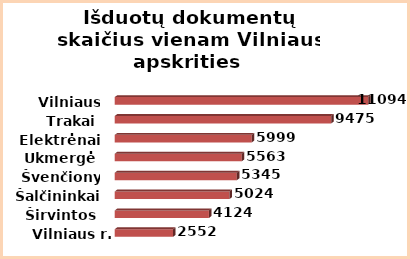
| Category | Series 0 |
|---|---|
| Vilniaus r. | 2552 |
| Širvintos | 4124 |
| Šalčininkai | 5024 |
| Švenčionys | 5345 |
| Ukmergė | 5563 |
| Elektrėnai | 5999 |
| Trakai | 9475 |
| Vilniaus m. | 11094 |